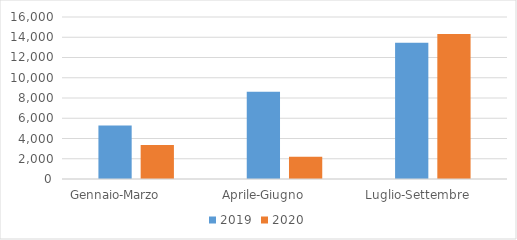
| Category | 2019 | 2020 |
|---|---|---|
| Gennaio-Marzo           | 5292 | 3361 |
| Aprile-Giugno           | 8609 | 2187 |
| Luglio-Settembre        | 13450 | 14319 |